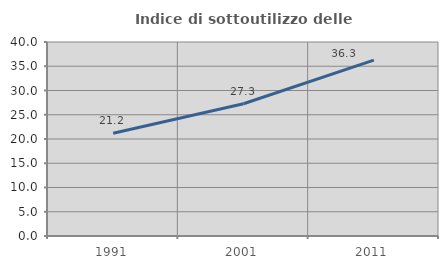
| Category | Indice di sottoutilizzo delle abitazioni  |
|---|---|
| 1991.0 | 21.2 |
| 2001.0 | 27.271 |
| 2011.0 | 36.273 |